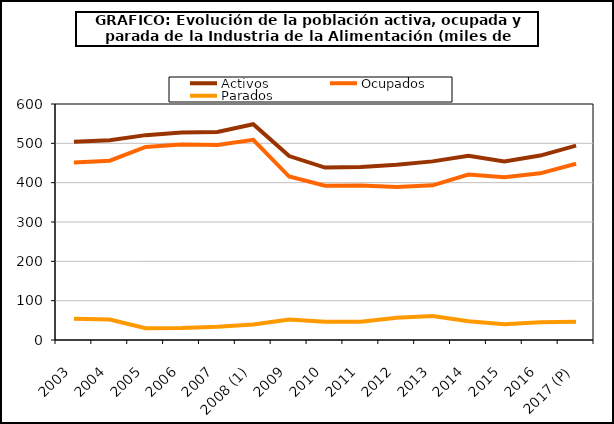
| Category | Activos | Ocupados | Parados |
|---|---|---|---|
| 2003 | 504 | 451.5 | 54 |
| 2004 | 508.05 | 455.9 | 52.175 |
| 2005 | 520.85 | 490.7 | 30.15 |
| 2006 | 527.375 | 496.9 | 30.475 |
| 2007 | 529 | 495.6 | 33.4 |
| 2008 (1) | 548.65 | 509 | 39.7 |
| 2009 | 467.6 | 415.6 | 52 |
| 2010 | 438.425 | 392.275 | 46.2 |
| 2011 | 439.6 | 393.1 | 46.5 |
| 2012 | 445.725 | 388.925 | 56.8 |
| 2013 | 454.1 | 393.3 | 60.8 |
| 2014 | 468.5 | 420.7 | 47.8 |
| 2015 | 454.1 | 414 | 40.1 |
| 2016 | 468.925 | 423.675 | 45.25 |
| 2017 (P) | 494.275 | 448.025 | 46.25 |